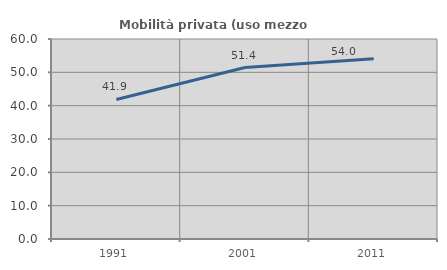
| Category | Mobilità privata (uso mezzo privato) |
|---|---|
| 1991.0 | 41.86 |
| 2001.0 | 51.446 |
| 2011.0 | 54.04 |